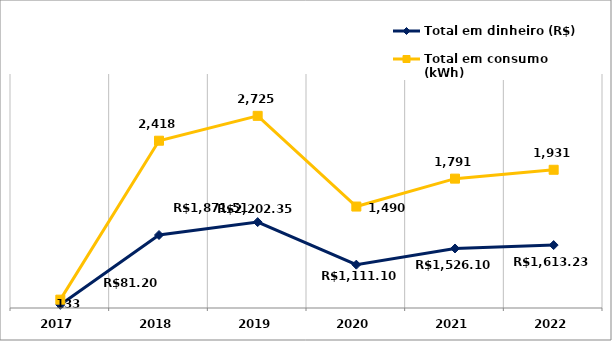
| Category | Total em dinheiro (R$) | Total em consumo (kWh) |
|---|---|---|
| 2017.0 | 81.2 | 133 |
| 2018.0 | 1871.51 | 2418 |
| 2019.0 | 2202.35 | 2725 |
| 2020.0 | 1111.1 | 1490 |
| 2021.0 | 1526.1 | 1791 |
| 2022.0 | 1613.23 | 1931 |